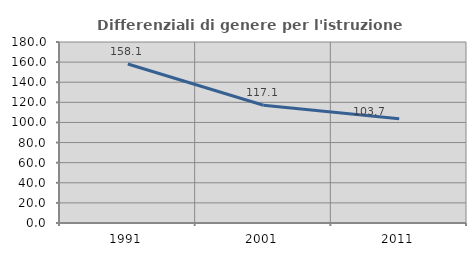
| Category | Differenziali di genere per l'istruzione superiore |
|---|---|
| 1991.0 | 158.135 |
| 2001.0 | 117.107 |
| 2011.0 | 103.721 |